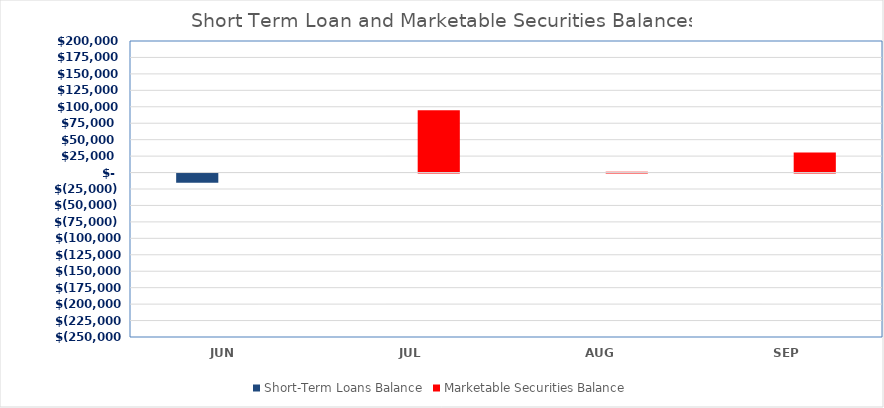
| Category | Short-Term Loans Balance | Marketable Securities Balance |
|---|---|---|
| JUN | -13800 | 0 |
| JUL | 0 | 94800 |
| AUG | 0 | 1300 |
| SEP | 0 | 30650 |